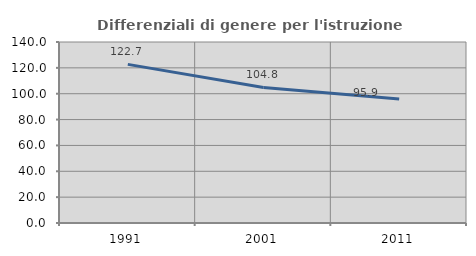
| Category | Differenziali di genere per l'istruzione superiore |
|---|---|
| 1991.0 | 122.706 |
| 2001.0 | 104.844 |
| 2011.0 | 95.887 |